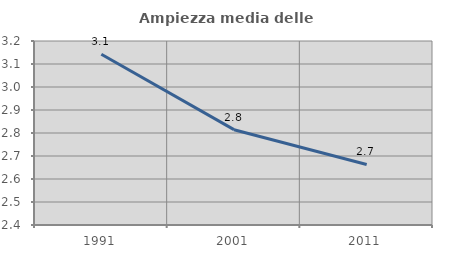
| Category | Ampiezza media delle famiglie |
|---|---|
| 1991.0 | 3.142 |
| 2001.0 | 2.814 |
| 2011.0 | 2.663 |